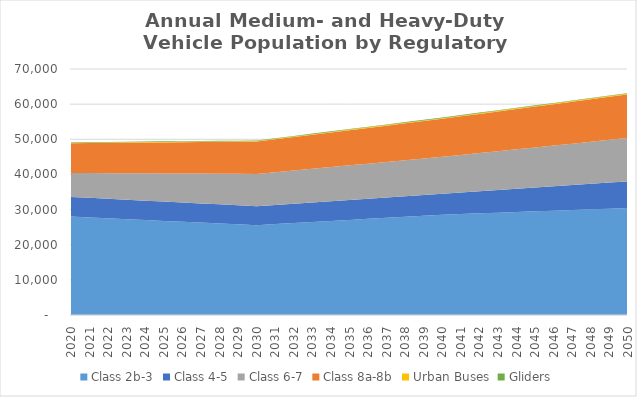
| Category | Class 2b-3 | Class 4-5 | Class 6-7 | Class 8a-8b | Urban Buses | Gliders |
|---|---|---|---|---|---|---|
| 2020.0 | 28000 | 5600 | 6820 | 8440 | 150 | 120 |
| 2021.0 | 27760 | 5580 | 7060 | 8520 | 150 | 130 |
| 2022.0 | 27510 | 5560 | 7300 | 8590 | 150 | 130 |
| 2023.0 | 27270 | 5540 | 7530 | 8670 | 150 | 140 |
| 2024.0 | 27020 | 5520 | 7770 | 8740 | 150 | 140 |
| 2025.0 | 26780 | 5500 | 8010 | 8820 | 150 | 150 |
| 2026.0 | 26540 | 5480 | 8250 | 8890 | 150 | 150 |
| 2027.0 | 26290 | 5460 | 8490 | 8970 | 150 | 160 |
| 2028.0 | 26050 | 5430 | 8720 | 9040 | 150 | 160 |
| 2029.0 | 25800 | 5410 | 8960 | 9120 | 150 | 170 |
| 2030.0 | 25560 | 5390 | 9200 | 9190 | 150 | 170 |
| 2031.0 | 25860 | 5450 | 9330 | 9350 | 150 | 170 |
| 2032.0 | 26160 | 5500 | 9460 | 9510 | 150 | 170 |
| 2033.0 | 26460 | 5560 | 9600 | 9680 | 160 | 180 |
| 2034.0 | 26760 | 5610 | 9730 | 9840 | 160 | 180 |
| 2035.0 | 27060 | 5670 | 9860 | 10000 | 160 | 180 |
| 2036.0 | 27360 | 5720 | 9990 | 10160 | 160 | 180 |
| 2037.0 | 27660 | 5780 | 10120 | 10320 | 170 | 180 |
| 2038.0 | 27960 | 5830 | 10260 | 10490 | 170 | 180 |
| 2039.0 | 28260 | 5890 | 10390 | 10650 | 180 | 180 |
| 2040.0 | 28560 | 5940 | 10520 | 10810 | 180 | 180 |
| 2041.0 | 28750 | 6110 | 10700 | 10970 | 180 | 180 |
| 2042.0 | 28940 | 6270 | 10880 | 11130 | 190 | 180 |
| 2043.0 | 29120 | 6440 | 11060 | 11290 | 190 | 170 |
| 2044.0 | 29310 | 6600 | 11240 | 11450 | 200 | 170 |
| 2045.0 | 29500 | 6770 | 11420 | 11610 | 200 | 170 |
| 2046.0 | 29690 | 6930 | 11600 | 11770 | 200 | 170 |
| 2047.0 | 29880 | 7100 | 11780 | 11930 | 200 | 170 |
| 2048.0 | 30070 | 7260 | 11970 | 12090 | 210 | 170 |
| 2049.0 | 30260 | 7430 | 12150 | 12250 | 210 | 170 |
| 2050.0 | 30450 | 7590 | 12330 | 12410 | 210 | 170 |